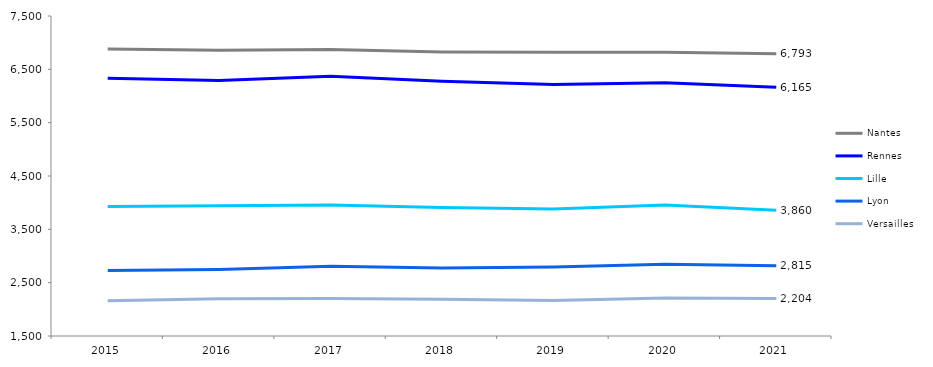
| Category | Nantes | Rennes | Lille | Lyon | Versailles |
|---|---|---|---|---|---|
| 2015.0 | 6883 | 6332 | 3928 | 2728 | 2161 |
| 2016.0 | 6859 | 6291 | 3942 | 2749 | 2199 |
| 2017.0 | 6871 | 6372 | 3955 | 2810 | 2202 |
| 2018.0 | 6826 | 6277 | 3909 | 2774 | 2189 |
| 2019.0 | 6820 | 6217 | 3883 | 2793 | 2165 |
| 2020.0 | 6820 | 6248 | 3955 | 2846 | 2214 |
| 2021.0 | 6793 | 6165 | 3860 | 2815 | 2204 |